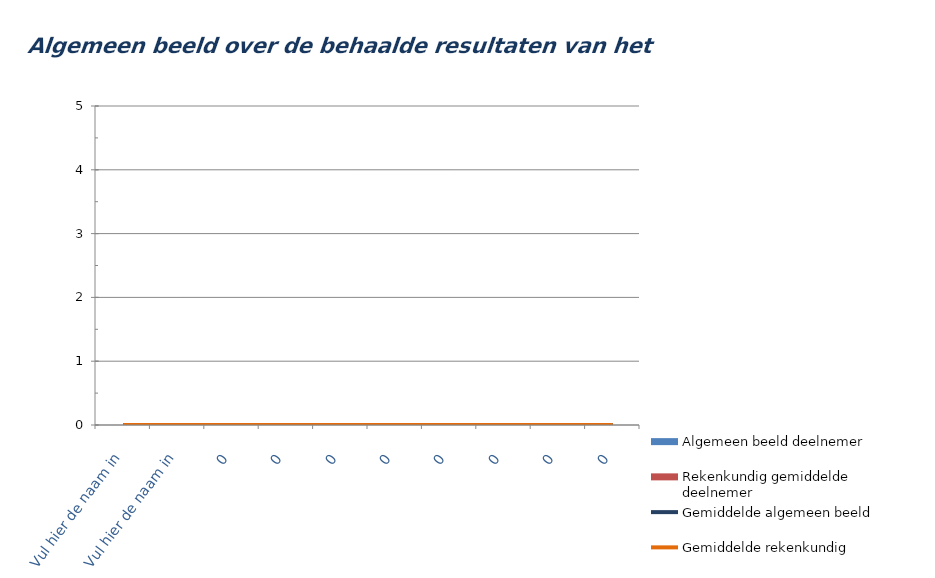
| Category | Algemeen beeld deelnemer | Rekenkundig gemiddelde deelnemer |
|---|---|---|
| Vul hier de naam in | 0 | 0 |
| Vul hier de naam in | 0 | 0 |
| 0 | 0 | 0 |
| 0 | 0 | 0 |
| 0 | 0 | 0 |
| 0 | 0 | 0 |
| 0 | 0 | 0 |
| 0 | 0 | 0 |
| 0 | 0 | 0 |
| 0 | 0 | 0 |